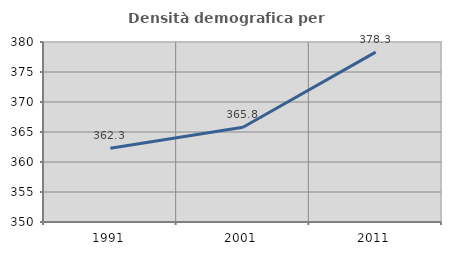
| Category | Densità demografica |
|---|---|
| 1991.0 | 362.305 |
| 2001.0 | 365.794 |
| 2011.0 | 378.307 |